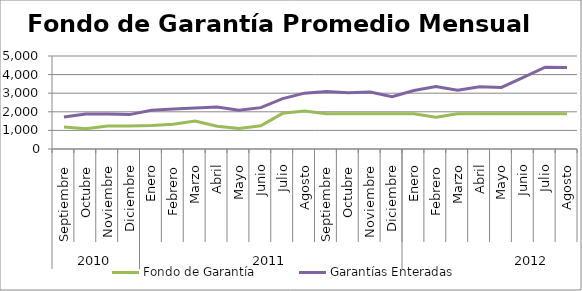
| Category | Fondo de Garantía | Garantías Enteradas |
|---|---|---|
| 0 | 1186.765 | 1723.136 |
| 1 | 1091.277 | 1878.561 |
| 2 | 1240.142 | 1886.493 |
| 3 | 1233.184 | 1848.941 |
| 4 | 1267.175 | 2079.773 |
| 5 | 1328.315 | 2151.804 |
| 6 | 1507.218 | 2200.488 |
| 7 | 1222.61 | 2253.818 |
| 8 | 1097.438 | 2081.441 |
| 9 | 1248.758 | 2223.666 |
| 10 | 1917.982 | 2706.525 |
| 11 | 2038.339 | 3002.384 |
| 12 | 1900.513 | 3095.395 |
| 13 | 1900.513 | 3029.373 |
| 14 | 1900.513 | 3060.179 |
| 15 | 1900.513 | 2809.042 |
| 16 | 1896.798 | 3141.641 |
| 17 | 1714.423 | 3362.648 |
| 18 | 1900.513 | 3154.118 |
| 19 | 1900.513 | 3348.058 |
| 20 | 1898.685 | 3308.859 |
| 21 | 1900.513 | 3850.375 |
| 22 | 1900.513 | 4400.539 |
| 23 | 1895.388 | 4383.327 |